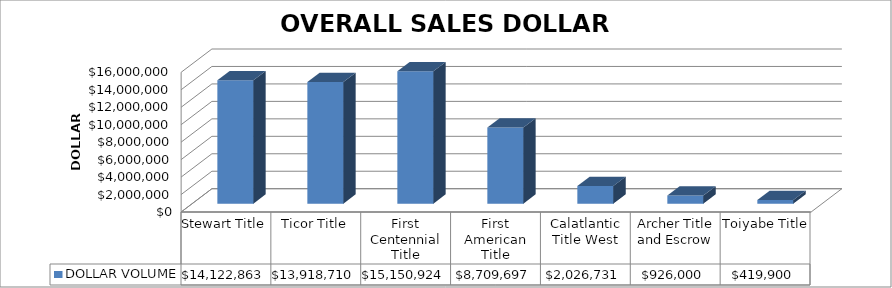
| Category | DOLLAR VOLUME |
|---|---|
| Stewart Title | 14122863 |
| Ticor Title | 13918710 |
| First Centennial Title | 15150924 |
| First American Title | 8709697.45 |
| Calatlantic Title West | 2026731 |
| Archer Title and Escrow | 926000 |
| Toiyabe Title | 419900 |